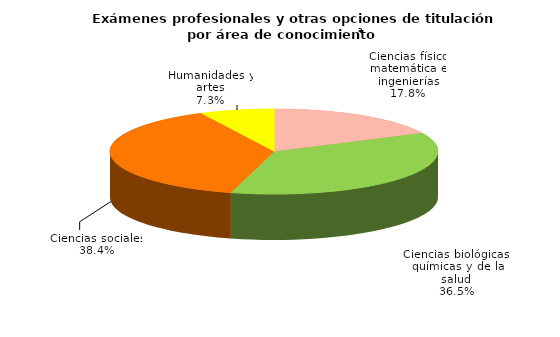
| Category | Series 0 |
|---|---|
| Ciencias físico matemática e ingenierías | 4349 |
| Ciencias biológicas, químicas y de la salud | 8919 |
| Ciencias sociales | 9405 |
| Humanidades y artes | 1790 |